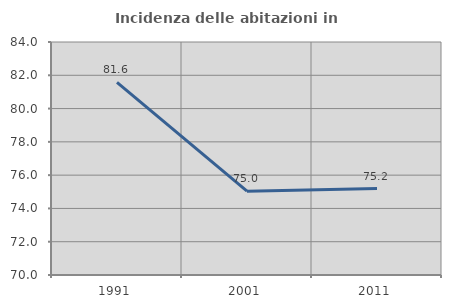
| Category | Incidenza delle abitazioni in proprietà  |
|---|---|
| 1991.0 | 81.571 |
| 2001.0 | 75.034 |
| 2011.0 | 75.194 |